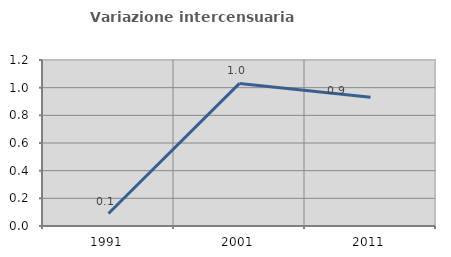
| Category | Variazione intercensuaria annua |
|---|---|
| 1991.0 | 0.09 |
| 2001.0 | 1.031 |
| 2011.0 | 0.93 |